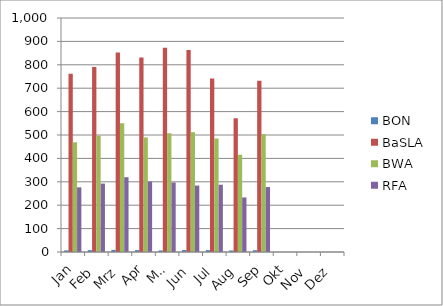
| Category | BON | BaSLA | BWA | RFA |
|---|---|---|---|---|
| Jan | 6.955 | 761.409 | 469 | 276.273 |
| Feb | 7.9 | 790.15 | 496.9 | 292.3 |
| Mrz | 8.95 | 852.1 | 550.45 | 319.6 |
| Apr | 8 | 831.048 | 489.619 | 301 |
| Mai | 6.75 | 872.85 | 507.5 | 296.95 |
| Jun | 8.45 | 862.95 | 512.1 | 283.85 |
| Jul | 8 | 741.957 | 485.13 | 287.522 |
| Aug | 6.714 | 571.095 | 415.667 | 233.095 |
| Sep | 7.619 | 731.429 | 503.238 | 277.571 |
| Okt | 0 | 0 | 0 | 0 |
| Nov | 0 | 0 | 0 | 0 |
| Dez | 0 | 0 | 0 | 0 |